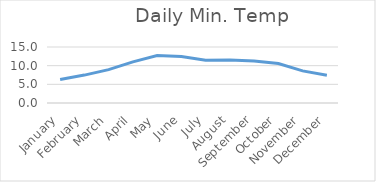
| Category | Series 0 |
|---|---|
| January | 6.3 |
| February | 7.473 |
| March | 8.949 |
| April | 11.03 |
| May | 12.69 |
| June | 12.436 |
| July | 11.443 |
| August | 11.487 |
| September | 11.257 |
| October | 10.554 |
| November | 8.597 |
| December | 7.44 |